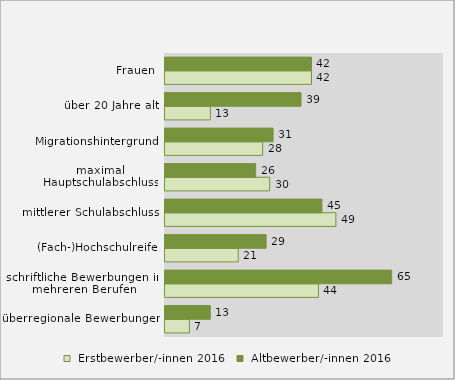
| Category |  Erstbewerber/-innen 2016 |  Altbewerber/-innen 2016 |
|---|---|---|
| überregionale Bewerbungen | 7 | 13 |
| schriftliche Bewerbungen in mehreren Berufen | 44 | 65 |
| (Fach-)Hochschulreife | 21 | 29 |
| mittlerer Schulabschluss | 49 | 45 |
| maximal Hauptschulabschluss | 30 | 26 |
| Migrationshintergrund | 28 | 31 |
| über 20 Jahre alt | 13 | 39 |
| Frauen | 42 | 42 |